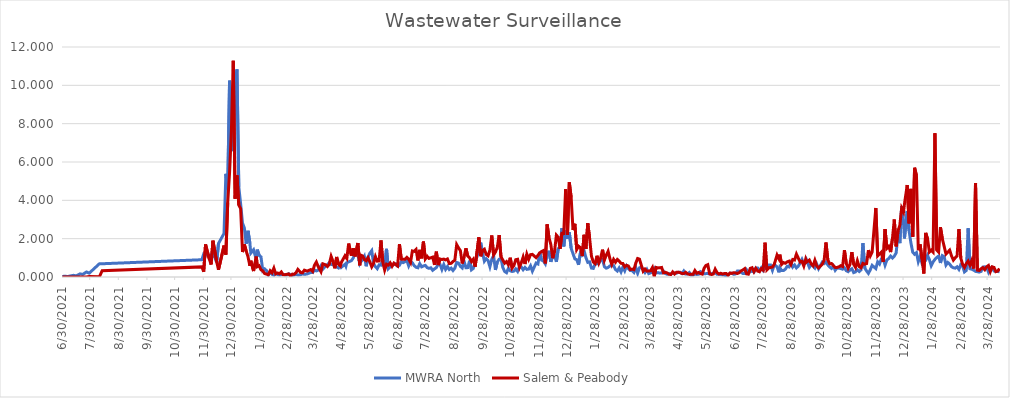
| Category | MWRA North | Salem & Peabody |
|---|---|---|
| 6/30/21 | 0.023 | 0 |
| 7/2/21 | 0.04 | 0 |
| 7/6/21 | 0.027 | 0 |
| 7/8/21 | 0.05 | 0 |
| 7/12/21 | 0.087 | 0 |
| 7/15/21 | 0.059 | 0 |
| 7/19/21 | 0.163 | 0 |
| 7/22/21 | 0.136 | 0 |
| 7/26/21 | 0.263 | 0 |
| 7/29/21 | 0.2 | 0.032 |
| 8/9/21 | 0.691 | 0.007 |
| 8/12/21 | 0.691 | 0.329 |
| 11/28/21 | 0.901 | 0.528 |
| 11/30/21 | 1.204 | 0.275 |
| 12/2/21 | 1.163 | 1.699 |
| 12/6/21 | 1.093 | 0.943 |
| 12/8/21 | 1.152 | 0.651 |
| 12/10/21 | 1.257 | 1.895 |
| 12/14/21 | 0.765 | 0.806 |
| 12/16/21 | 1.751 | 0.377 |
| 12/22/21 | 2.277 | 1.638 |
| 12/24/21 | 5.383 | 1.167 |
| 12/26/21 | 4.572 | 3.882 |
| 12/28/21 | 10.243 | 5.443 |
| 12/30/21 | 8.435 | 7.638 |
| 1/1/22 | 6.568 | 11.282 |
| 1/3/22 | 10.196 | 4.086 |
| 1/5/22 | 10.833 | 5.297 |
| 1/7/22 | 4.705 | 3.753 |
| 1/9/22 | 3.807 | 3.57 |
| 1/11/22 | 2.813 | 1.302 |
| 1/13/22 | 2.562 | 1.704 |
| 1/15/22 | 1.737 | 1.36 |
| 1/17/22 | 2.411 | 1.052 |
| 1/19/22 | 1.766 | 0.581 |
| 1/20/22 | 1.245 | 0.849 |
| 1/23/22 | 1.42 | 0.312 |
| 1/26/22 | 0.904 | 1.062 |
| 1/27/22 | 1.426 | 0.538 |
| 1/29/22 | 1.132 | 0.587 |
| 1/31/22 | 1.053 | 0.378 |
| 2/2/22 | 0.334 | 0.319 |
| 2/4/22 | 0.422 | 0.179 |
| 2/6/22 | 0.336 | 0.151 |
| 2/8/22 | 0.11 | 0.116 |
| 2/10/22 | 0.233 | 0.327 |
| 2/12/22 | 0.14 | 0.223 |
| 2/14/22 | 0.094 | 0.461 |
| 2/16/22 | 0.206 | 0.164 |
| 2/18/22 | 0.124 | 0.209 |
| 2/20/22 | 0.101 | 0.169 |
| 2/22/22 | 0.124 | 0.267 |
| 2/24/22 | 0.138 | 0.116 |
| 2/26/22 | 0.113 | 0.121 |
| 2/28/22 | 0.102 | 0.138 |
| 3/2/22 | 0.17 | 0.16 |
| 3/4/22 | 0.121 | 0.039 |
| 3/6/22 | 0.08 | 0.151 |
| 3/8/22 | 0.105 | 0.146 |
| 3/10/22 | 0.139 | 0.227 |
| 3/12/22 | 0.105 | 0.397 |
| 3/15/22 | 0.115 | 0.231 |
| 3/17/22 | 0.165 | 0.219 |
| 3/19/22 | 0.138 | 0.356 |
| 3/22/22 | 0.161 | 0.308 |
| 3/26/22 | 0.236 | 0.388 |
| 3/28/22 | 0.23 | 0.293 |
| 3/30/22 | 0.371 | 0.617 |
| 4/1/22 | 0.316 | 0.779 |
| 4/3/22 | 0.358 | 0.54 |
| 4/6/22 | 0.589 | 0.279 |
| 4/8/22 | 0.411 | 0.688 |
| 4/11/22 | 0.565 | 0.635 |
| 4/13/22 | 0.647 | 0.546 |
| 4/15/22 | 0.752 | 0.666 |
| 4/17/22 | 0.654 | 1.077 |
| 4/19/22 | 0.641 | 0.82 |
| 4/21/22 | 0.571 | 0.454 |
| 4/23/22 | 0.524 | 1.046 |
| 4/25/22 | 0.471 | 0.662 |
| 4/27/22 | 0.623 | 0.575 |
| 4/28/22 | 0.505 | 0.756 |
| 5/2/22 | 0.662 | 1.104 |
| 5/3/22 | 0.561 | 1.022 |
| 5/4/22 | 0.751 | 0.963 |
| 5/6/22 | 0.789 | 1.744 |
| 5/9/22 | 0.853 | 1.115 |
| 5/11/22 | 0.995 | 1.498 |
| 5/13/22 | 1.285 | 1.074 |
| 5/16/22 | 1.143 | 1.773 |
| 5/18/22 | 0.696 | 0.611 |
| 5/19/22 | 0.784 | 1.144 |
| 5/21/22 | 0.906 | 1.1 |
| 5/23/22 | 1.077 | 0.91 |
| 5/25/22 | 0.561 | 0.853 |
| 5/27/22 | 1.043 | 1.006 |
| 5/29/22 | 1.246 | 0.785 |
| 5/31/22 | 1.375 | 0.53 |
| 6/2/22 | 0.696 | 0.713 |
| 6/4/22 | 0.532 | 1.066 |
| 6/6/22 | 0.435 | 0.828 |
| 6/8/22 | 0.636 | 0.839 |
| 6/10/22 | 0.619 | 1.907 |
| 6/12/22 | 0.932 | 0.783 |
| 6/14/22 | 0.461 | 0.361 |
| 6/16/22 | 1.468 | 0.667 |
| 6/18/22 | 0.433 | 0.622 |
| 6/20/22 | 0.532 | 0.737 |
| 6/22/22 | 0.611 | 0.559 |
| 6/24/22 | 0.648 | 0.724 |
| 6/26/22 | 0.688 | 0.646 |
| 6/28/22 | 0.562 | 0.577 |
| 6/30/22 | 0.607 | 1.712 |
| 7/2/22 | 0.8 | 0.932 |
| 7/4/22 | 0.751 | 0.927 |
| 7/6/22 | 0.8 | 0.928 |
| 7/8/22 | 0.861 | 1.027 |
| 7/10/22 | 0.579 | 0.928 |
| 7/12/22 | 0.808 | 0.757 |
| 7/14/22 | 0.742 | 1.358 |
| 7/16/22 | 0.592 | 1.335 |
| 7/18/22 | 0.509 | 1.432 |
| 7/20/22 | 0.482 | 0.863 |
| 7/22/22 | 0.695 | 1.416 |
| 7/24/22 | 0.53 | 0.974 |
| 7/26/22 | 0.576 | 1.848 |
| 7/28/22 | 0.605 | 0.943 |
| 7/30/22 | 0.492 | 1.081 |
| 8/1/22 | 0.453 | 0.969 |
| 8/3/22 | 0.481 | 1.003 |
| 8/5/22 | 0.349 | 1.038 |
| 8/7/22 | 0.424 | 0.634 |
| 8/9/22 | 0.492 | 1.322 |
| 8/11/22 | 0.664 | 0.624 |
| 8/13/22 | 0.648 | 0.94 |
| 8/15/22 | 0.393 | 0.912 |
| 8/17/22 | 0.648 | 0.935 |
| 8/19/22 | 0.397 | 0.892 |
| 8/21/22 | 0.546 | 0.94 |
| 8/23/22 | 0.392 | 0.701 |
| 8/25/22 | 0.461 | 0.713 |
| 8/27/22 | 0.339 | 0.812 |
| 8/29/22 | 0.46 | 0.873 |
| 8/31/22 | 0.758 | 1.69 |
| 9/2/22 | 0.728 | 1.519 |
| 9/4/22 | 0.557 | 1.377 |
| 9/6/22 | 0.473 | 0.706 |
| 9/8/22 | 0.826 | 1.041 |
| 9/10/22 | 0.485 | 1.497 |
| 9/12/22 | 0.489 | 1.095 |
| 9/14/22 | 0.851 | 0.994 |
| 9/16/22 | 0.375 | 0.804 |
| 9/18/22 | 0.45 | 0.926 |
| 9/20/22 | 0.767 | 0.537 |
| 9/24/22 | 1.357 | 2.067 |
| 9/26/22 | 1.79 | 1.083 |
| 9/28/22 | 1.272 | 1.382 |
| 9/30/22 | 0.825 | 1.447 |
| 10/2/22 | 0.959 | 1.18 |
| 10/4/22 | 0.862 | 1.109 |
| 10/6/22 | 0.536 | 1.407 |
| 10/8/22 | 0.925 | 2.166 |
| 10/10/22 | 1.104 | 1.147 |
| 10/12/22 | 0.369 | 1.304 |
| 10/14/22 | 0.781 | 1.544 |
| 10/16/22 | 0.928 | 2.189 |
| 10/18/22 | 0.972 | 1.054 |
| 10/20/22 | 0.493 | 0.883 |
| 10/22/22 | 0.287 | 0.721 |
| 10/24/22 | 0.224 | 0.803 |
| 10/26/22 | 0.45 | 0.639 |
| 10/28/22 | 0.325 | 1.007 |
| 10/30/22 | 0.287 | 0.464 |
| 11/1/22 | 0.307 | 0.6 |
| 11/3/22 | 0.421 | 0.904 |
| 11/5/22 | 0.293 | 0.926 |
| 11/7/22 | 0.54 | 0.505 |
| 11/9/22 | 0.525 | 0.742 |
| 11/11/22 | 0.38 | 1.039 |
| 11/13/22 | 0.5 | 0.678 |
| 11/15/22 | 0.397 | 1.19 |
| 11/17/22 | 0.414 | 0.927 |
| 11/19/22 | 0.583 | 1.166 |
| 11/21/22 | 0.304 | 1.181 |
| 11/25/22 | 0.727 | 1.009 |
| 11/27/22 | 0.682 | 1.128 |
| 11/29/22 | 1.292 | 1.263 |
| 12/1/22 | 0.879 | 1.332 |
| 12/3/22 | 0.834 | 1.378 |
| 12/5/22 | 0.685 | 0.71 |
| 12/7/22 | 1.094 | 2.747 |
| 12/9/22 | 1.37 | 2.05 |
| 12/11/22 | 0.792 | 1.692 |
| 12/13/22 | 1.108 | 0.983 |
| 12/15/22 | 1.123 | 1.348 |
| 12/17/22 | 0.789 | 2.185 |
| 12/19/22 | 1.476 | 2.073 |
| 12/21/22 | 1.593 | 1.47 |
| 12/23/22 | 2.551 | 2.278 |
| 12/25/22 | 1.597 | 2.275 |
| 12/27/22 | 2.423 | 4.578 |
| 12/29/22 | 2.003 | 2.196 |
| 12/31/22 | 2.33 | 4.939 |
| 1/2/23 | 1.499 | 4.153 |
| 1/4/23 | 1.214 | 2.457 |
| 1/6/23 | 0.947 | 2.778 |
| 1/8/23 | 0.904 | 1.437 |
| 1/10/23 | 0.64 | 1.61 |
| 1/12/23 | 1.241 | 1.532 |
| 1/14/23 | 1.154 | 1.092 |
| 1/16/23 | 1.37 | 2.202 |
| 1/18/23 | 1.009 | 1.465 |
| 1/20/23 | 0.763 | 2.809 |
| 1/22/23 | 0.787 | 2.022 |
| 1/24/23 | 0.465 | 1.08 |
| 1/26/23 | 0.448 | 0.782 |
| 1/28/23 | 0.685 | 0.698 |
| 1/30/23 | 0.689 | 1.11 |
| 2/1/23 | 0.706 | 0.743 |
| 2/3/23 | 0.907 | 1.008 |
| 2/5/23 | 0.913 | 1.425 |
| 2/7/23 | 0.539 | 0.879 |
| 2/9/23 | 0.461 | 1.141 |
| 2/11/23 | 0.498 | 1.339 |
| 2/13/23 | 0.579 | 0.95 |
| 2/15/23 | 0.588 | 0.66 |
| 2/17/23 | 0.592 | 0.919 |
| 2/19/23 | 0.391 | 0.773 |
| 2/21/23 | 0.312 | 0.917 |
| 2/23/23 | 0.472 | 0.828 |
| 2/25/23 | 0.266 | 0.714 |
| 2/27/23 | 0.513 | 0.704 |
| 3/1/23 | 0.321 | 0.528 |
| 3/3/23 | 0.58 | 0.61 |
| 3/5/23 | 0.437 | 0.573 |
| 3/7/23 | 0.341 | 0.388 |
| 3/9/23 | 0.33 | 0.412 |
| 3/11/23 | 0.24 | 0.383 |
| 3/13/23 | 0.499 | 0.725 |
| 3/15/23 | 0.197 | 0.964 |
| 3/17/23 | 0.479 | 0.931 |
| 3/19/23 | 0.51 | 0.612 |
| 3/21/23 | 0.399 | 0.301 |
| 3/23/23 | 0.237 | 0.415 |
| 3/25/23 | 0.395 | 0.308 |
| 3/27/23 | 0.178 | 0.314 |
| 3/29/23 | 0.217 | 0.326 |
| 3/31/23 | 0.243 | 0.491 |
| 4/2/23 | 0.43 | 0.024 |
| 4/4/23 | 0.215 | 0.5 |
| 4/6/23 | 0.229 | 0.475 |
| 4/8/23 | 0.202 | 0.481 |
| 4/10/23 | 0.209 | 0.497 |
| 4/12/23 | 0.305 | 0.215 |
| 4/14/23 | 0.182 | 0.243 |
| 4/16/23 | 0.142 | 0.21 |
| 4/18/23 | 0.177 | 0.143 |
| 4/20/23 | 0.158 | 0.13 |
| 4/22/23 | 0.195 | 0.266 |
| 4/24/23 | 0.209 | 0.158 |
| 4/26/23 | 0.195 | 0.249 |
| 4/28/23 | 0.245 | 0.25 |
| 4/30/23 | 0.245 | 0.228 |
| 5/2/23 | 0.18 | 0.185 |
| 5/4/23 | 0.314 | 0.177 |
| 5/6/23 | 0.157 | 0.247 |
| 5/8/23 | 0.162 | 0.165 |
| 5/10/23 | 0.234 | 0.135 |
| 5/12/23 | 0.1 | 0.143 |
| 5/14/23 | 0.1 | 0.144 |
| 5/16/23 | 0.156 | 0.338 |
| 5/18/23 | 0.134 | 0.195 |
| 5/20/23 | 0.141 | 0.237 |
| 5/22/23 | 0.279 | 0.178 |
| 5/24/23 | 0.223 | 0.15 |
| 5/26/23 | 0.176 | 0.458 |
| 5/28/23 | 0.176 | 0.602 |
| 5/30/23 | 0.183 | 0.643 |
| 6/1/23 | 0.153 | 0.167 |
| 6/3/23 | 0.172 | 0.13 |
| 6/5/23 | 0.198 | 0.156 |
| 6/7/23 | 0.243 | 0.409 |
| 6/9/23 | 0.143 | 0.231 |
| 6/11/23 | 0.143 | 0.16 |
| 6/13/23 | 0.122 | 0.195 |
| 6/15/23 | 0.11 | 0.156 |
| 6/17/23 | 0.095 | 0.181 |
| 6/19/23 | 0.054 | 0.18 |
| 6/21/23 | 0.122 | 0.089 |
| 6/23/23 | 0.195 | 0.208 |
| 6/25/23 | 0.195 | 0.187 |
| 6/27/23 | 0.141 | 0.225 |
| 6/29/23 | 0.16 | 0.211 |
| 7/1/23 | 0.31 | 0.183 |
| 7/3/23 | 0.312 | 0.225 |
| 7/5/23 | 0.244 | 0.321 |
| 7/7/23 | 0.184 | 0.366 |
| 7/9/23 | 0.184 | 0.437 |
| 7/11/23 | 0.38 | 0.163 |
| 7/13/23 | 0.255 | 0.147 |
| 7/15/23 | 0.268 | 0.451 |
| 7/17/23 | 0.315 | 0.484 |
| 7/19/23 | 0.252 | 0.278 |
| 7/21/23 | 0.47 | 0.451 |
| 7/23/23 | 0.47 | 0.309 |
| 7/25/23 | 0.325 | 0.277 |
| 7/27/23 | 0.478 | 0.439 |
| 7/29/23 | 0.339 | 0.359 |
| 7/31/23 | 0.538 | 1.791 |
| 8/2/23 | 0.514 | 0.375 |
| 8/4/23 | 0.625 | 0.476 |
| 8/6/23 | 0.625 | 0.501 |
| 8/8/23 | 0.347 | 0.517 |
| 8/10/23 | 0.645 | 0.663 |
| 8/13/23 | 0.533 | 1.145 |
| 8/15/23 | 0.245 | 0.951 |
| 8/16/23 | 0.489 | 1.169 |
| 8/18/23 | 0.336 | 0.656 |
| 8/20/23 | 0.336 | 0.753 |
| 8/22/23 | 0.407 | 0.717 |
| 8/24/23 | 0.558 | 0.79 |
| 8/26/23 | 0.526 | 0.826 |
| 8/28/23 | 0.757 | 0.651 |
| 8/30/23 | 0.52 | 0.914 |
| 9/1/23 | 0.628 | 0.889 |
| 9/3/23 | 0.475 | 1.194 |
| 9/5/23 | 0.563 | 0.989 |
| 9/7/23 | 0.731 | 0.782 |
| 9/9/23 | 0.922 | 0.819 |
| 9/11/23 | 0.696 | 0.573 |
| 9/13/23 | 0.75 | 0.928 |
| 9/14/23 | 0.882 | 0.78 |
| 9/17/23 | 0.503 | 0.884 |
| 9/19/23 | 0.645 | 0.68 |
| 9/21/23 | 0.575 | 0.58 |
| 9/23/23 | 0.465 | 0.87 |
| 9/25/23 | 0.673 | 0.57 |
| 9/27/23 | 0.429 | 0.47 |
| 10/1/23 | 0.773 | 0.67 |
| 10/3/23 | 0.702 | 0.88 |
| 10/5/23 | 0.78 | 1.8 |
| 10/7/23 | 0.63 | 0.9 |
| 10/9/23 | 0.524 | 0.69 |
| 10/11/23 | 0.448 | 0.7 |
| 10/13/23 | 0.571 | 0.6 |
| 10/15/23 | 0.35 | 0.5 |
| 10/17/23 | 0.468 | 0.5 |
| 10/19/23 | 0.46 | 0.53 |
| 10/21/23 | 0.442 | 0.59 |
| 10/23/23 | 0.407 | 0.55 |
| 10/25/23 | 0.475 | 1.4 |
| 10/27/23 | 0.329 | 0.7 |
| 10/29/23 | 0.277 | 0.46 |
| 10/31/23 | 0.366 | 0.66 |
| 11/2/23 | 0.431 | 1.3 |
| 11/4/23 | 0.23 | 0.66 |
| 11/6/23 | 0.268 | 0.5 |
| 11/8/23 | 0.372 | 0.85 |
| 11/10/23 | 0.287 | 0.54 |
| 11/12/23 | 0.373 | 0.48 |
| 11/14/23 | 1.767 | 0.71 |
| 11/16/23 | 0.468 | 0.67 |
| 11/18/23 | 0.315 | 0.7 |
| 11/20/23 | 0.188 | 1.4 |
| 11/22/23 | 0.38 | 1.1 |
| 11/24/23 | 0.608 | 1.3 |
| 11/28/23 | 0.44 | 3.6 |
| 11/30/23 | 0.791 | 1.1 |
| 12/2/23 | 0.677 | 1.2 |
| 12/4/23 | 0.943 | 1.3 |
| 12/6/23 | 0.966 | 0.79 |
| 12/8/23 | 0.618 | 2.5 |
| 12/10/23 | 0.892 | 1.5 |
| 12/12/23 | 0.964 | 1.6 |
| 12/14/23 | 1.091 | 1.3 |
| 12/16/23 | 0.99 | 2 |
| 12/18/23 | 1.089 | 3 |
| 12/20/23 | 1.252 | 1.6 |
| 12/22/23 | 2.214 | 2.4 |
| 12/24/23 | 1.769 | 2.7 |
| 12/26/23 | 3.689 | 3.6 |
| 12/28/23 | 2.81 | 3.4 |
| 12/29/23 | 2.013 | 3.8 |
| 1/1/24 | 3.443 | 4.8 |
| 1/3/24 | 2.411 | 2.8 |
| 1/5/24 | 1.78 | 4.6 |
| 1/7/24 | 1.295 | 2.1 |
| 1/9/24 | 1.184 | 5.7 |
| 1/11/24 | 1.27 | 5.3 |
| 1/13/24 | 0.802 | 1.4 |
| 1/15/24 | 1.091 | 1.7 |
| 1/17/24 | 0.716 | 0.94 |
| 1/19/24 | 0.852 | 0.18 |
| 1/21/24 | 0.866 | 2.3 |
| 1/23/24 | 1.127 | 2 |
| 1/25/24 | 0.911 | 1.3 |
| 1/27/24 | 0.591 | 1.4 |
| 1/29/24 | 0.786 | 1.3 |
| 1/31/24 | 0.915 | 7.5 |
| 2/2/24 | 1.022 | 1.4 |
| 2/4/24 | 1.092 | 1.3 |
| 2/6/24 | 0.732 | 2.6 |
| 2/8/24 | 1.114 | 2 |
| 2/10/24 | 1.061 | 1.6 |
| 2/12/24 | 0.622 | 1.2 |
| 2/14/24 | 0.758 | 1.3 |
| 2/16/24 | 0.672 | 1.4 |
| 2/18/24 | 0.536 | 1.1 |
| 2/20/24 | 0.483 | 0.88 |
| 2/22/24 | 0.462 | 1 |
| 2/24/24 | 0.532 | 1.1 |
| 2/26/24 | 0.398 | 2.5 |
| 2/28/24 | 0.647 | 0.99 |
| 3/1/24 | 0.579 | 0.66 |
| 3/3/24 | 0.265 | 0.5 |
| 3/5/24 | 0.341 | 0.7 |
| 3/7/24 | 2.546 | 0.83 |
| 3/9/24 | 0.429 | 0.62 |
| 3/11/24 | 0.407 | 0.87 |
| 3/13/24 | 0.358 | 0.44 |
| 3/15/24 | 0.293 | 4.9 |
| 3/17/24 | 0.275 | 0.36 |
| 3/19/24 | 0.256 | 0.34 |
| 3/21/24 | 0.289 | 0.43 |
| 3/23/24 | 0.517 | 0.49 |
| 3/25/24 | 0.532 | 0.38 |
| 3/27/24 | 0.511 | 0.53 |
| 3/29/24 | 0.256 | 0.6 |
| 3/31/24 | 0.474 | 0.28 |
| 4/2/24 | 0.507 | 0.53 |
| 4/4/24 | 0.315 | 0.5 |
| 4/6/24 | 0.284 | 0.28 |
| 4/8/24 | 0.287 | 0.31 |
| 4/10/24 | 0.272 | 0.44 |